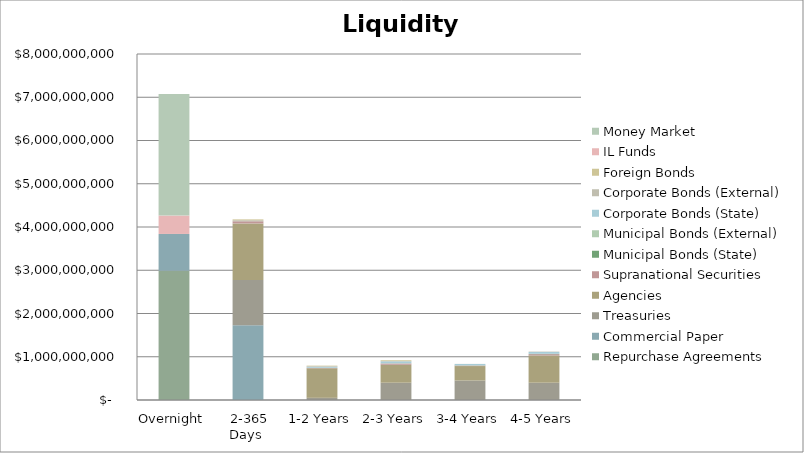
| Category | Series 0 | Repurchase Agreements | Commercial Paper | Treasuries | Agencies | Supranational Securities | Municipal Bonds (State) | Municipal Bonds (External) | Corporate Bonds (State) | Corporate Bonds (External) | Foreign Bonds | IL Funds | Money Market |
|---|---|---|---|---|---|---|---|---|---|---|---|---|---|
| Overnight |  | 2989000000 | 850000000 | 0 | 0 | 0 | 0 | 0 | 0 | 0 | 0 | 425000000 | 2810000000 |
| 2-365 Days |  | 0 | 1726345000 | 1050000000 | 1306001000 | 50000000 | 0 | 2155000 | 0 | 21550000 | 20000000 | 0 | 0 |
| 1-2 Years |  | 0 | 0 | 50000000 | 684000000 | 10000000 | 585000 | 985000 | 24166000 | 14435000 | 10000000 | 0 | 0 |
| 2-3 Years |  | 0 | 0 | 400000000 | 414005000 | 30000000 | 805000 | 4635000 | 45023000 | 4055000 | 20000000 | 0 | 0 |
| 3-4 Years |  | 0 | 0 | 450000000 | 335000000 | 10000000 | 2950000 | 4345000 | 30000000 | 2125000 | 0 | 0 | 0 |
| 4-5 Years |  | 0 | 0 | 400000000 | 630031000 | 30000000 | 5225000 | 3585000 | 42089000 | 7835000 | 0 | 0 | 0 |